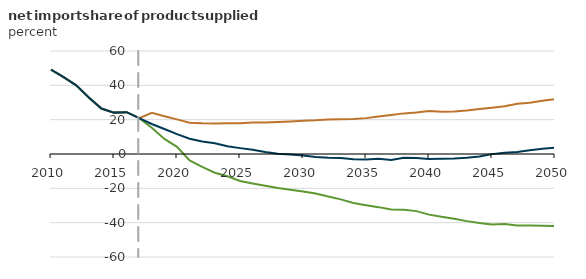
| Category | High oil and gas resource and technology | Low oil and gas resource and technology | Reference |
|---|---|---|---|
| 2010.0 | 49.162 | 49.162 | 49.162 |
| 2011.0 | 44.772 | 44.772 | 44.772 |
| 2012.0 | 40.021 | 40.021 | 40.021 |
| 2013.0 | 32.877 | 32.877 | 32.877 |
| 2014.0 | 26.487 | 26.487 | 26.487 |
| 2015.0 | 24.105 | 24.105 | 24.105 |
| 2016.0 | 24.371 | 24.371 | 24.371 |
| 2017.0 | 20.859 | 20.859 | 20.859 |
| 2018.0 | 15.336 | 23.96 | 17.475 |
| 2019.0 | 8.806 | 21.998 | 14.591 |
| 2020.0 | 4.175 | 20.184 | 11.546 |
| 2021.0 | -3.696 | 18.244 | 8.909 |
| 2022.0 | -7.556 | 17.92 | 7.273 |
| 2023.0 | -10.937 | 17.83 | 6.263 |
| 2024.0 | -12.948 | 17.872 | 4.528 |
| 2025.0 | -15.698 | 17.977 | 3.417 |
| 2026.0 | -17.126 | 18.278 | 2.426 |
| 2027.0 | -18.513 | 18.278 | 1.103 |
| 2028.0 | -19.762 | 18.646 | 0.206 |
| 2029.0 | -20.835 | 18.957 | -0.256 |
| 2030.0 | -21.804 | 19.411 | -0.862 |
| 2031.0 | -23.038 | 19.653 | -1.791 |
| 2032.0 | -24.71 | 20.068 | -2.218 |
| 2033.0 | -26.425 | 20.232 | -2.356 |
| 2034.0 | -28.518 | 20.372 | -3.089 |
| 2035.0 | -29.794 | 20.898 | -3.221 |
| 2036.0 | -30.956 | 21.907 | -2.815 |
| 2037.0 | -32.324 | 22.705 | -3.428 |
| 2038.0 | -32.502 | 23.661 | -2.212 |
| 2039.0 | -33.274 | 24.149 | -2.364 |
| 2040.0 | -35.321 | 25.05 | -2.843 |
| 2041.0 | -36.596 | 24.647 | -2.808 |
| 2042.0 | -37.686 | 24.827 | -2.659 |
| 2043.0 | -39.105 | 25.334 | -2.251 |
| 2044.0 | -40.208 | 26.2 | -1.494 |
| 2045.0 | -41.064 | 27.001 | -0.068 |
| 2046.0 | -40.832 | 27.855 | 0.66 |
| 2047.0 | -41.702 | 29.22 | 1.137 |
| 2048.0 | -41.675 | 29.802 | 2.243 |
| 2049.0 | -41.737 | 30.996 | 3.106 |
| 2050.0 | -41.926 | 31.906 | 3.744 |